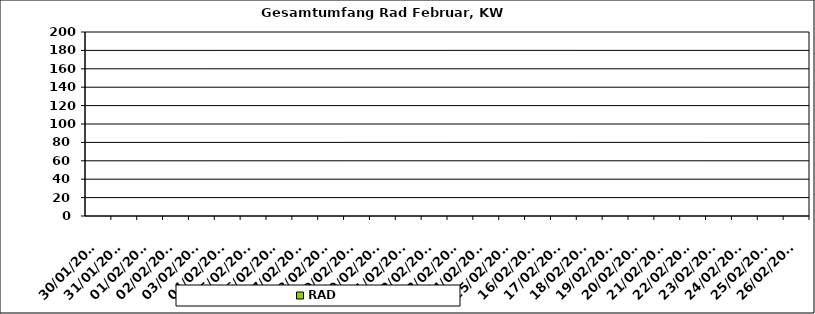
| Category | RAD |
|---|---|
| 30/01/2023 | 0 |
| 31/01/2023 | 0 |
| 01/02/2023 | 0 |
| 02/02/2023 | 0 |
| 03/02/2023 | 0 |
| 04/02/2023 | 0 |
| 05/02/2023 | 0 |
| 06/02/2023 | 0 |
| 07/02/2023 | 0 |
| 08/02/2023 | 0 |
| 09/02/2023 | 0 |
| 10/02/2023 | 0 |
| 11/02/2023 | 0 |
| 12/02/2023 | 0 |
| 13/02/2023 | 0 |
| 14/02/2023 | 0 |
| 15/02/2023 | 0 |
| 16/02/2023 | 0 |
| 17/02/2023 | 0 |
| 18/02/2023 | 0 |
| 19/02/2023 | 0 |
| 20/02/2023 | 0 |
| 21/02/2023 | 0 |
| 22/02/2023 | 0 |
| 23/02/2023 | 0 |
| 24/02/2023 | 0 |
| 25/02/2023 | 0 |
| 26/02/2023 | 0 |